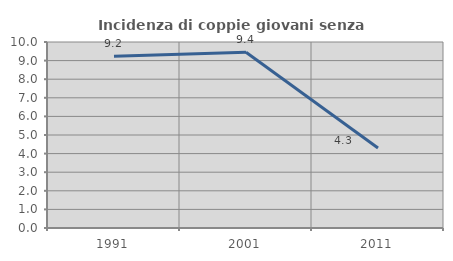
| Category | Incidenza di coppie giovani senza figli |
|---|---|
| 1991.0 | 9.233 |
| 2001.0 | 9.444 |
| 2011.0 | 4.304 |